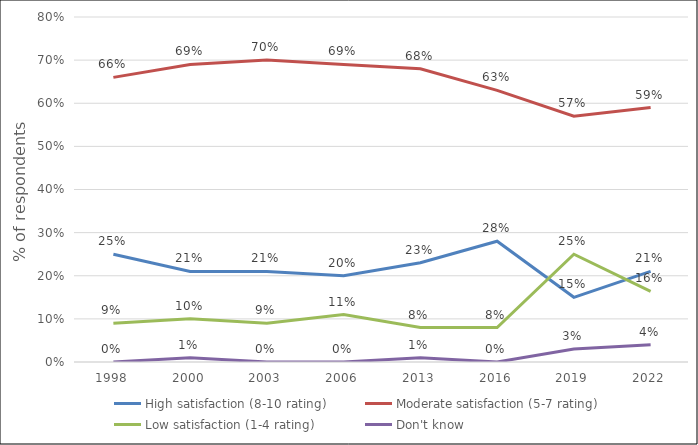
| Category | High satisfaction (8-10 rating) | Moderate satisfaction (5-7 rating) | Low satisfaction (1-4 rating) | Don't know |
|---|---|---|---|---|
| 1998.0 | 0.25 | 0.66 | 0.09 | 0 |
| 2000.0 | 0.21 | 0.69 | 0.1 | 0.01 |
| 2003.0 | 0.21 | 0.7 | 0.09 | 0 |
| 2006.0 | 0.2 | 0.69 | 0.11 | 0 |
| 2013.0 | 0.23 | 0.68 | 0.08 | 0.01 |
| 2016.0 | 0.28 | 0.63 | 0.08 | 0 |
| 2019.0 | 0.15 | 0.57 | 0.25 | 0.03 |
| 2022.0 | 0.21 | 0.59 | 0.164 | 0.04 |